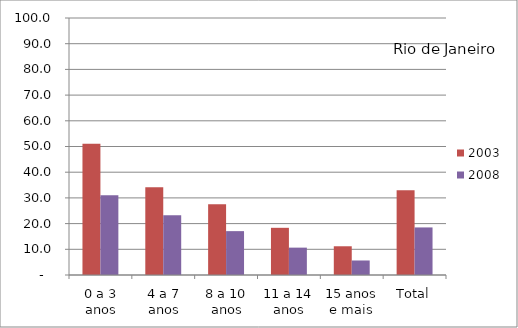
| Category | 2003 | 2008 |
|---|---|---|
| 0 a 3 anos | 51.05 | 31.03 |
| 4 a 7 anos | 34.15 | 23.23 |
| 8 a 10 anos | 27.49 | 17.07 |
| 11 a 14 anos | 18.36 | 10.65 |
| 15 anos e mais | 11.18 | 5.65 |
| Total | 32.93 | 18.51 |